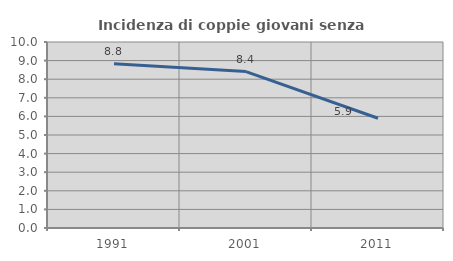
| Category | Incidenza di coppie giovani senza figli |
|---|---|
| 1991.0 | 8.831 |
| 2001.0 | 8.411 |
| 2011.0 | 5.901 |